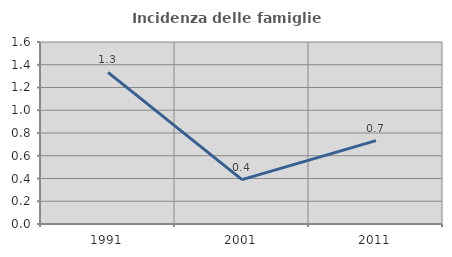
| Category | Incidenza delle famiglie numerose |
|---|---|
| 1991.0 | 1.333 |
| 2001.0 | 0.391 |
| 2011.0 | 0.733 |